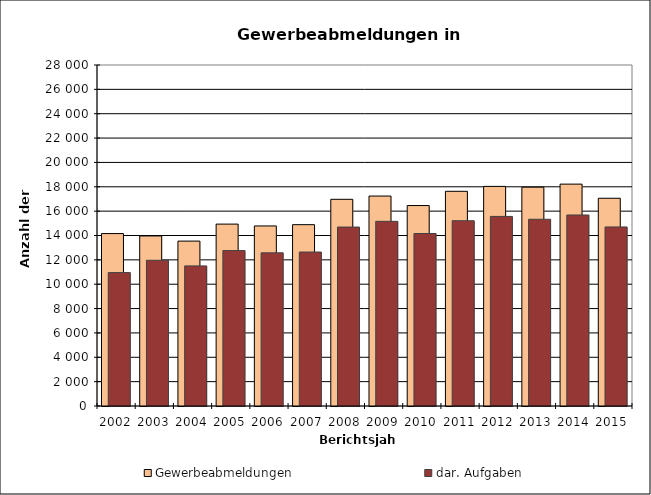
| Category | Gewerbeabmeldungen | dar. Aufgaben |
|---|---|---|
| 2002.0 | 14158 | 10953 |
| 2003.0 | 13964 | 11965 |
| 2004.0 | 13540 | 11504 |
| 2005.0 | 14936 | 12763 |
| 2006.0 | 14785 | 12576 |
| 2007.0 | 14890 | 12642 |
| 2008.0 | 16972 | 14693 |
| 2009.0 | 17240 | 15163 |
| 2010.0 | 16460 | 14163 |
| 2011.0 | 17629 | 15213 |
| 2012.0 | 18032 | 15567 |
| 2013.0 | 17968 | 15333 |
| 2014.0 | 18219 | 15684 |
| 2015.0 | 17058 | 14703 |